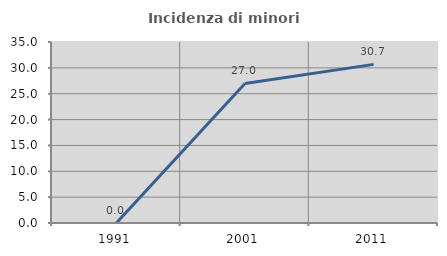
| Category | Incidenza di minori stranieri |
|---|---|
| 1991.0 | 0 |
| 2001.0 | 26.984 |
| 2011.0 | 30.675 |